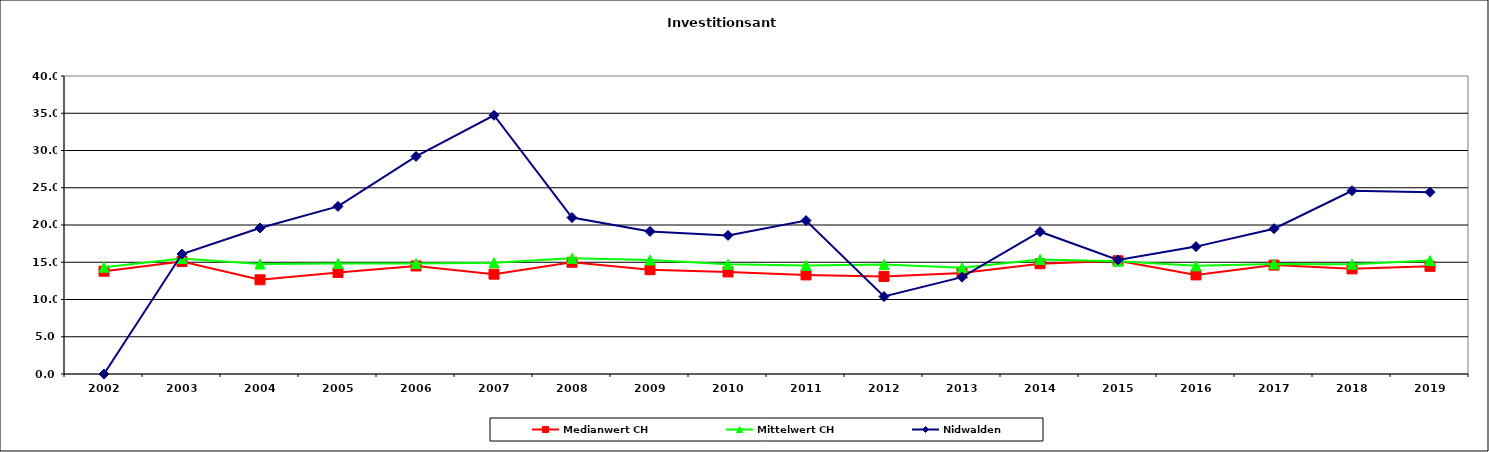
| Category | Medianwert CH | Mittelwert CH | Nidwalden |
|---|---|---|---|
| 2002.0 | 13.8 | 14.325 | 0 |
| 2003.0 | 15.1 | 15.5 | 16.1 |
| 2004.0 | 12.65 | 14.763 | 19.6 |
| 2005.0 | 13.62 | 14.838 | 22.5 |
| 2006.0 | 14.5 | 14.827 | 29.2 |
| 2007.0 | 13.4 | 14.936 | 34.73 |
| 2008.0 | 15 | 15.524 | 21 |
| 2009.0 | 14 | 15.293 | 19.13 |
| 2010.0 | 13.7 | 14.722 | 18.6 |
| 2011.0 | 13.3 | 14.574 | 20.6 |
| 2012.0 | 13.1 | 14.682 | 10.4 |
| 2013.0 | 13.55 | 14.269 | 13 |
| 2014.0 | 14.8 | 15.38 | 19.1 |
| 2015.0 | 15.2 | 15.136 | 15.3 |
| 2016.0 | 13.3 | 14.519 | 17.1 |
| 2017.0 | 14.617 | 14.771 | 19.5 |
| 2018.0 | 14.111 | 14.742 | 24.6 |
| 2019.0 | 14.45 | 15.236 | 24.4 |